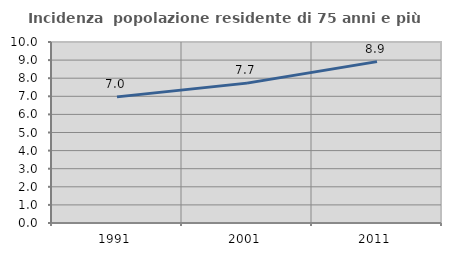
| Category | Incidenza  popolazione residente di 75 anni e più |
|---|---|
| 1991.0 | 6.968 |
| 2001.0 | 7.728 |
| 2011.0 | 8.917 |